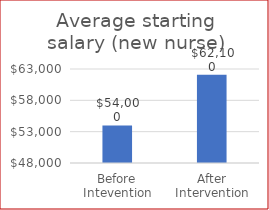
| Category | Average starting salary (new nurse) |
|---|---|
| Before Intevention | 54000 |
| After Intervention | 621 |